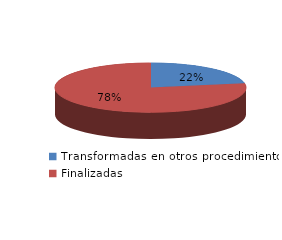
| Category | Series 0 |
|---|---|
| Transformadas en otros procedimientos | 1272 |
| Finalizadas | 4481 |